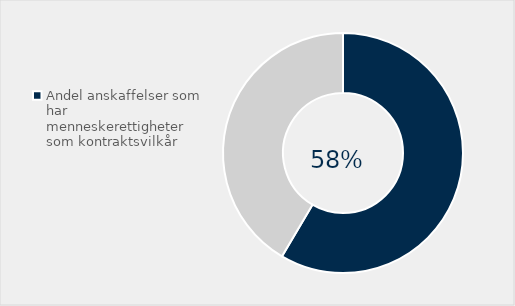
| Category | Series 0 |
|---|---|
| Andel anskaffelser som har menneskerettigheter som kontraktsvilkår | 0.585 |
| Ikke stilt krav | 0.415 |